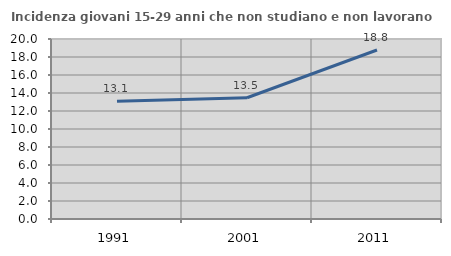
| Category | Incidenza giovani 15-29 anni che non studiano e non lavorano  |
|---|---|
| 1991.0 | 13.07 |
| 2001.0 | 13.469 |
| 2011.0 | 18.779 |